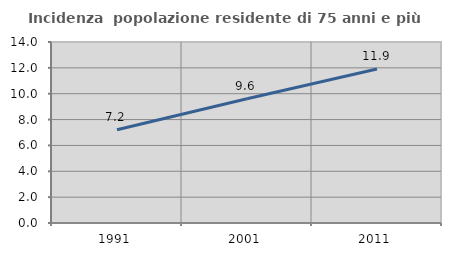
| Category | Incidenza  popolazione residente di 75 anni e più |
|---|---|
| 1991.0 | 7.209 |
| 2001.0 | 9.615 |
| 2011.0 | 11.908 |